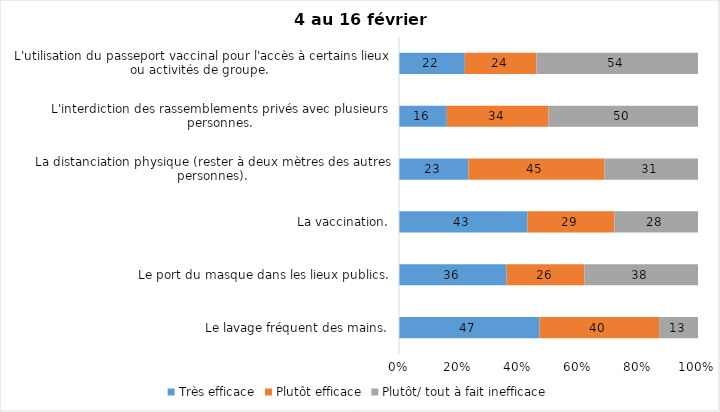
| Category | Très efficace | Plutôt efficace | Plutôt/ tout à fait inefficace |
|---|---|---|---|
| Le lavage fréquent des mains. | 47 | 40 | 13 |
| Le port du masque dans les lieux publics. | 36 | 26 | 38 |
| La vaccination. | 43 | 29 | 28 |
| La distanciation physique (rester à deux mètres des autres personnes). | 23 | 45 | 31 |
| L'interdiction des rassemblements privés avec plusieurs personnes. | 16 | 34 | 50 |
| L'utilisation du passeport vaccinal pour l'accès à certains lieux ou activités de groupe.  | 22 | 24 | 54 |